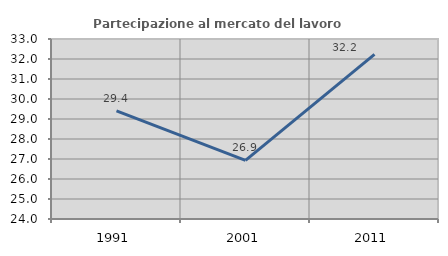
| Category | Partecipazione al mercato del lavoro  femminile |
|---|---|
| 1991.0 | 29.411 |
| 2001.0 | 26.929 |
| 2011.0 | 32.233 |